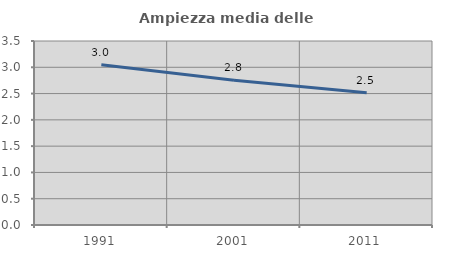
| Category | Ampiezza media delle famiglie |
|---|---|
| 1991.0 | 3.048 |
| 2001.0 | 2.752 |
| 2011.0 | 2.517 |